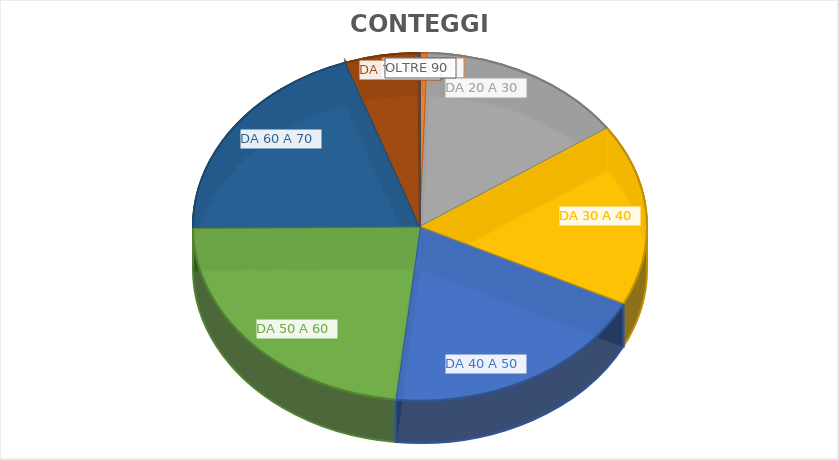
| Category | CONTEGGIO |
|---|---|
| DA 0 A 10 | 7 |
| DA 10 A 20 | 5594 |
| DA 20 A 30 | 151170 |
| DA 30 A 40 | 172055 |
| DA 40 A 50 | 197361 |
| DA 50 A 60 | 235912 |
| DA 60 A 70 | 201311 |
| DA 70 A 80 | 52936 |
| OLTRE 90 | 1154 |